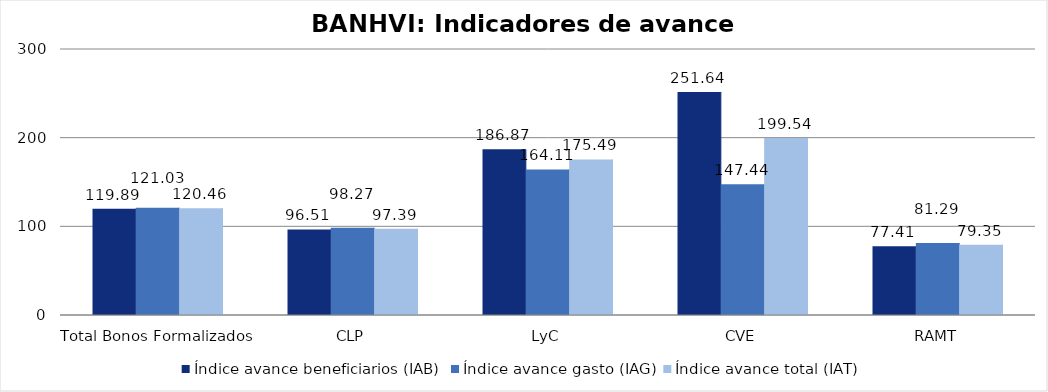
| Category | Índice avance beneficiarios (IAB)  | Índice avance gasto (IAG) | Índice avance total (IAT)  |
|---|---|---|---|
| Total Bonos Formalizados | 119.892 | 121.03 | 120.461 |
| CLP | 96.51 | 98.271 | 97.39 |
| LyC | 186.866 | 164.107 | 175.487 |
| CVE | 251.641 | 147.437 | 199.539 |
| RAMT | 77.408 | 81.291 | 79.349 |